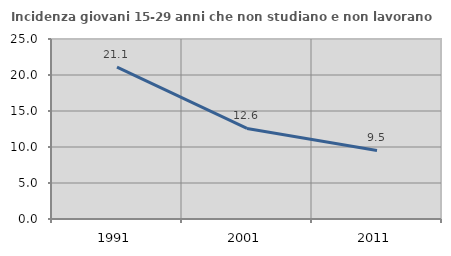
| Category | Incidenza giovani 15-29 anni che non studiano e non lavorano  |
|---|---|
| 1991.0 | 21.108 |
| 2001.0 | 12.583 |
| 2011.0 | 9.524 |